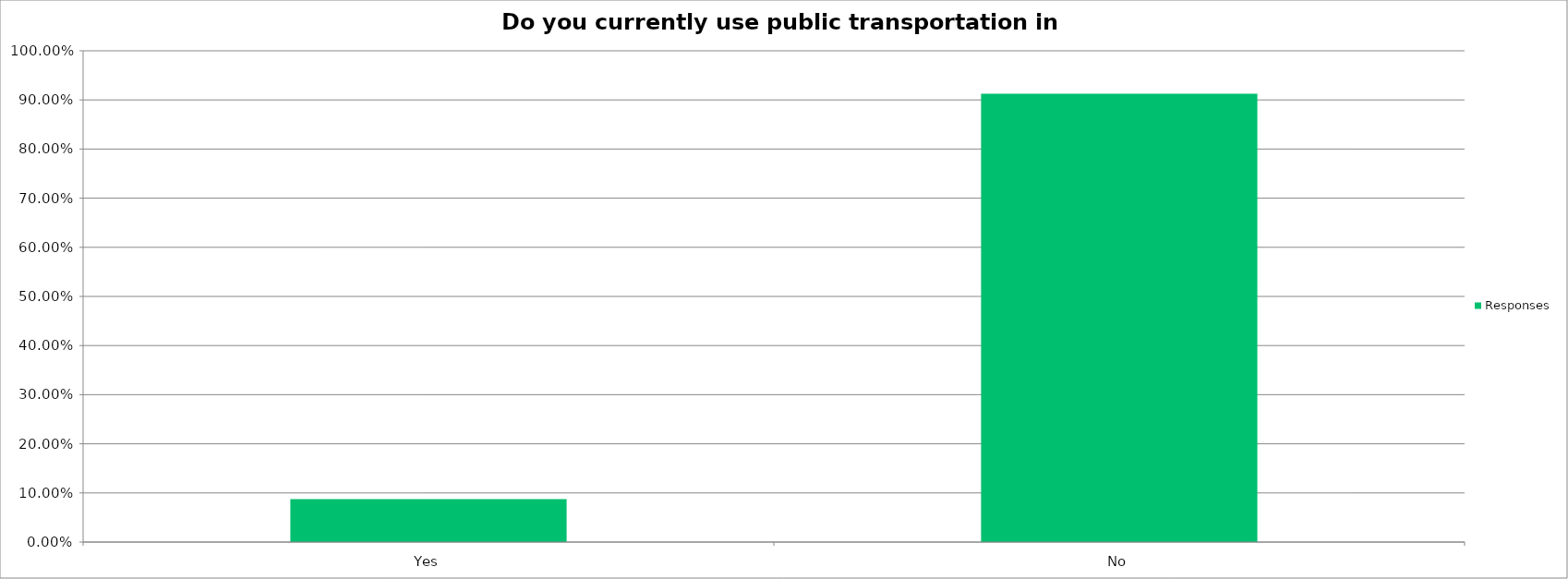
| Category | Responses |
|---|---|
| Yes | 0.088 |
| No | 0.912 |